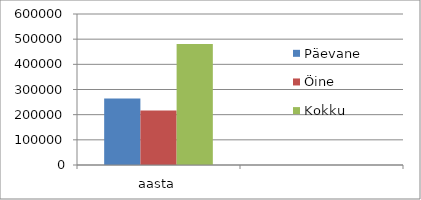
| Category | Päevane | Öine | Kokku |
|---|---|---|---|
| aasta | 264227.3 | 216777.6 | 481004.9 |